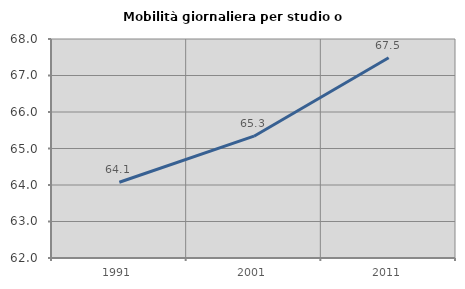
| Category | Mobilità giornaliera per studio o lavoro |
|---|---|
| 1991.0 | 64.075 |
| 2001.0 | 65.338 |
| 2011.0 | 67.485 |